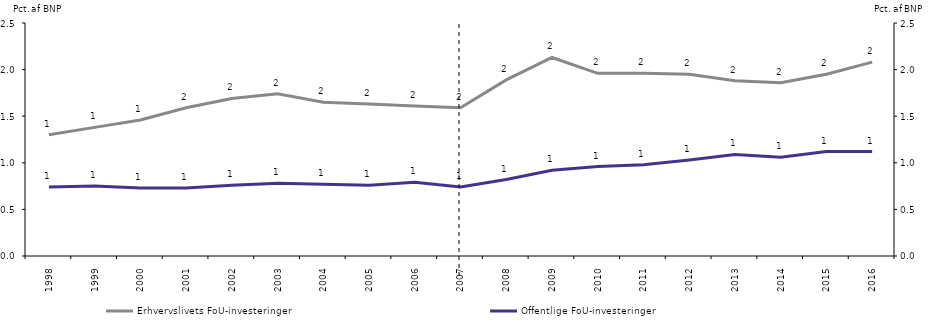
| Category | Erhvervslivets FoU-investeringer | Offentlige FoU-investeringer |
|---|---|---|
| 1998 | 1.3 | 0.74 |
| 1999 | 1.38 | 0.75 |
| 2000 | 1.46 | 0.73 |
| 2001 | 1.59 | 0.73 |
| 2002 | 1.69 | 0.76 |
| 2003 | 1.74 | 0.78 |
| 2004 | 1.65 | 0.77 |
| 2005 | 1.63 | 0.76 |
| 2006 | 1.61 | 0.79 |
| 2007 | 1.59 | 0.74 |
| 2008 | 1.89 | 0.82 |
| 2009 | 2.13 | 0.92 |
| 2010 | 1.96 | 0.96 |
| 2011 | 1.96 | 0.98 |
| 2012 | 1.95 | 1.03 |
| 2013 | 1.88 | 1.09 |
| 2014 | 1.86 | 1.06 |
| 2015 | 1.95 | 1.12 |
| 2016 | 2.08 | 1.12 |